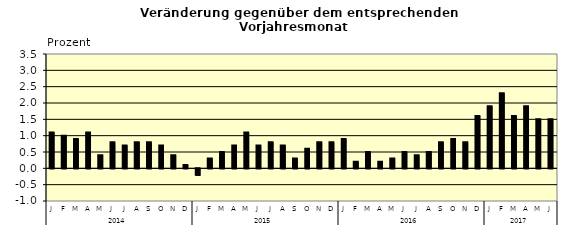
| Category | Series 0 |
|---|---|
| 0 | 1.1 |
| 1 | 1 |
| 2 | 0.9 |
| 3 | 1.1 |
| 4 | 0.4 |
| 5 | 0.8 |
| 6 | 0.7 |
| 7 | 0.8 |
| 8 | 0.8 |
| 9 | 0.7 |
| 10 | 0.4 |
| 11 | 0.1 |
| 12 | -0.2 |
| 13 | 0.3 |
| 14 | 0.5 |
| 15 | 0.7 |
| 16 | 1.1 |
| 17 | 0.7 |
| 18 | 0.8 |
| 19 | 0.7 |
| 20 | 0.3 |
| 21 | 0.6 |
| 22 | 0.8 |
| 23 | 0.8 |
| 24 | 0.9 |
| 25 | 0.2 |
| 26 | 0.5 |
| 27 | 0.2 |
| 28 | 0.3 |
| 29 | 0.5 |
| 30 | 0.4 |
| 31 | 0.5 |
| 32 | 0.8 |
| 33 | 0.9 |
| 34 | 0.8 |
| 35 | 1.6 |
| 36 | 1.9 |
| 37 | 2.3 |
| 38 | 1.6 |
| 39 | 1.9 |
| 40 | 1.5 |
| 41 | 1.5 |